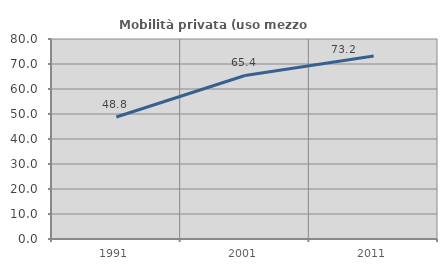
| Category | Mobilità privata (uso mezzo privato) |
|---|---|
| 1991.0 | 48.792 |
| 2001.0 | 65.411 |
| 2011.0 | 73.184 |